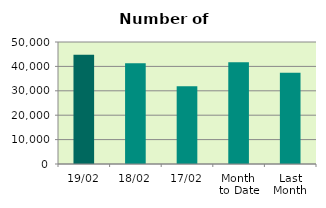
| Category | Series 0 |
|---|---|
| 19/02 | 44784 |
| 18/02 | 41258 |
| 17/02 | 31828 |
| Month 
to Date | 41707.692 |
| Last
Month | 37374.818 |